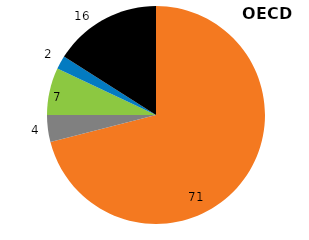
| Category | OECD |
|---|---|
| Energy | 71 |
| Industrial processes | 4 |
| Agriculture | 7 |
| Waste | 2 |
| Land-use change and forestry | 16 |